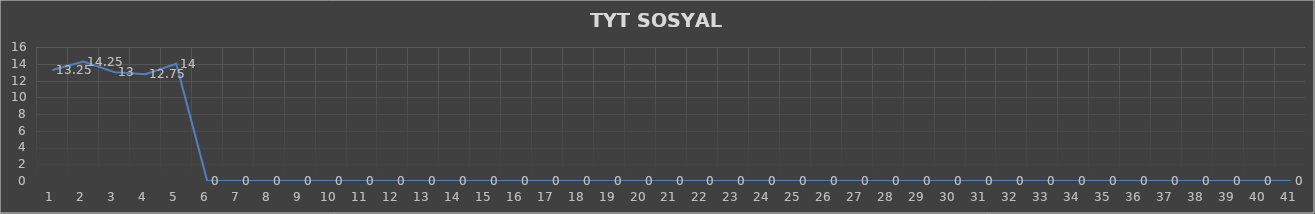
| Category | Series 0 |
|---|---|
| 0 | 13.25 |
| 1 | 14.25 |
| 2 | 13 |
| 3 | 12.75 |
| 4 | 14 |
| 5 | 0 |
| 6 | 0 |
| 7 | 0 |
| 8 | 0 |
| 9 | 0 |
| 10 | 0 |
| 11 | 0 |
| 12 | 0 |
| 13 | 0 |
| 14 | 0 |
| 15 | 0 |
| 16 | 0 |
| 17 | 0 |
| 18 | 0 |
| 19 | 0 |
| 20 | 0 |
| 21 | 0 |
| 22 | 0 |
| 23 | 0 |
| 24 | 0 |
| 25 | 0 |
| 26 | 0 |
| 27 | 0 |
| 28 | 0 |
| 29 | 0 |
| 30 | 0 |
| 31 | 0 |
| 32 | 0 |
| 33 | 0 |
| 34 | 0 |
| 35 | 0 |
| 36 | 0 |
| 37 | 0 |
| 38 | 0 |
| 39 | 0 |
| 40 | 0 |